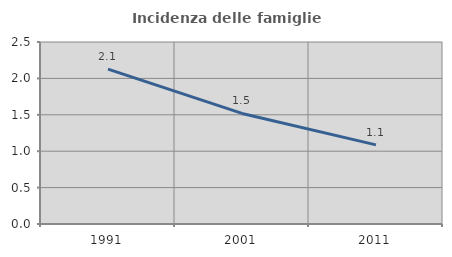
| Category | Incidenza delle famiglie numerose |
|---|---|
| 1991.0 | 2.128 |
| 2001.0 | 1.519 |
| 2011.0 | 1.087 |